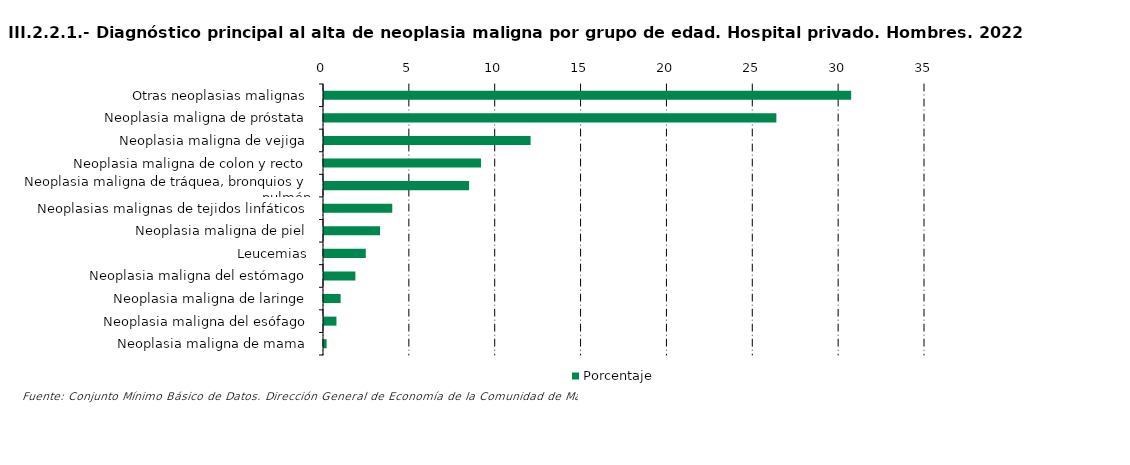
| Category | Porcentaje |
|---|---|
| Otras neoplasias malignas | 30.7 |
| Neoplasia maligna de próstata | 26.345 |
| Neoplasia maligna de vejiga | 12.031 |
| Neoplasia maligna de colon y recto | 9.144 |
| Neoplasia maligna de tráquea, bronquios y pulmón | 8.449 |
| Neoplasias malignas de tejidos linfáticos | 3.975 |
| Neoplasia maligna de piel | 3.265 |
| Leucemias | 2.433 |
| Neoplasia maligna del estómago | 1.829 |
| Neoplasia maligna de laringe | 0.967 |
| Neoplasia maligna del esófago | 0.726 |
| Neoplasia maligna de mama | 0.151 |